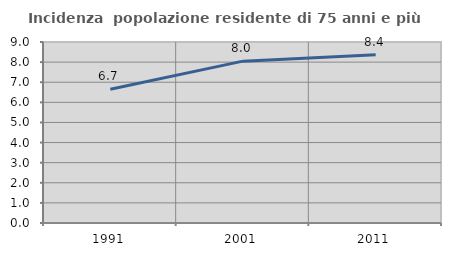
| Category | Incidenza  popolazione residente di 75 anni e più |
|---|---|
| 1991.0 | 6.653 |
| 2001.0 | 8.049 |
| 2011.0 | 8.372 |